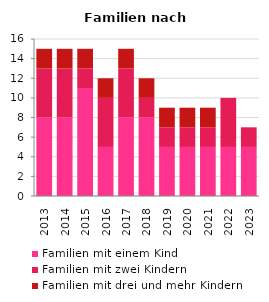
| Category | Familien mit einem Kind | Familien mit zwei Kindern | Familien mit drei und mehr Kindern |
|---|---|---|---|
| 2013.0 | 8 | 5 | 2 |
| 2014.0 | 8 | 5 | 2 |
| 2015.0 | 11 | 2 | 2 |
| 2016.0 | 5 | 5 | 2 |
| 2017.0 | 8 | 5 | 2 |
| 2018.0 | 8 | 2 | 2 |
| 2019.0 | 5 | 2 | 2 |
| 2020.0 | 5 | 2 | 2 |
| 2021.0 | 5 | 2 | 2 |
| 2022.0 | 5 | 5 | 0 |
| 2023.0 | 5 | 2 | 0 |